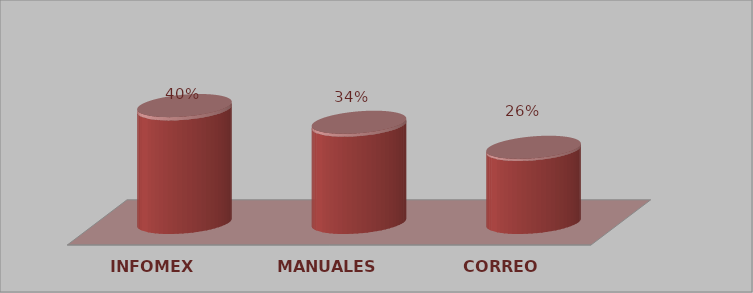
| Category | Series 0 | Series 1 |
|---|---|---|
| INFOMEX | 14 | 0.4 |
| MANUALES | 12 | 0.343 |
| CORREO | 9 | 0.257 |